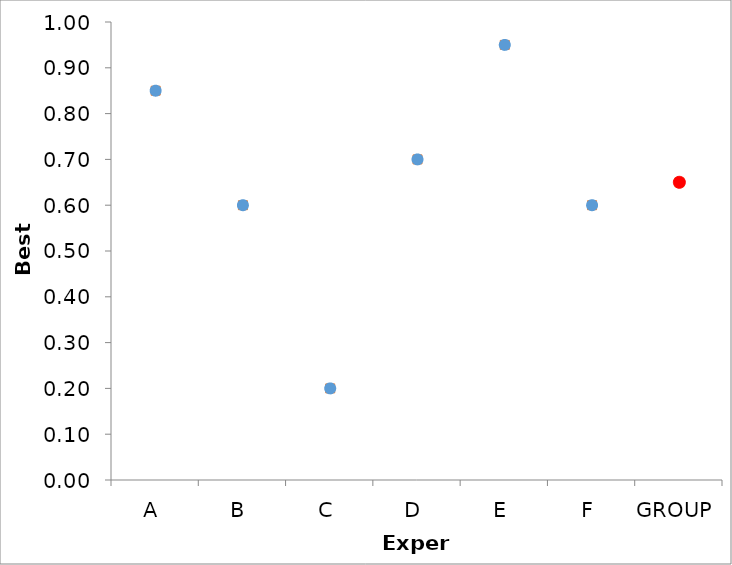
| Category | Series 1 | Series 0 |
|---|---|---|
| A | 0.85 | 0.85 |
| B | 0.6 | 0.6 |
| C | 0.2 | 0.2 |
| D | 0.7 | 0.7 |
| E | 0.95 | 0.95 |
| F | 0.6 | 0.6 |
| GROUP | 0.65 | 0.65 |